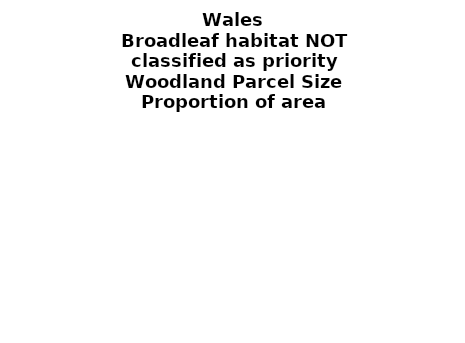
| Category | Broadleaf habitat NOT classified as priority |
|---|---|
| <5 ha | 0.246 |
| ≥5 and <10 ha | 0.048 |
| ≥10 and <15 ha | 0.024 |
| ≥15 and <20 ha | 0.04 |
| ≥20 and <25 ha | 0.022 |
| ≥25 and <30 ha | 0.012 |
| ≥30 and <35 ha | 0.043 |
| ≥35 and <40 ha | 0.003 |
| ≥40 and <45 ha | 0.01 |
| ≥45 and <50 ha | 0.046 |
| ≥50 and <60 ha | 0.008 |
| ≥60 and <70 ha | 0.004 |
| ≥70 and <80 ha | 0.001 |
| ≥80 and <90 ha | 0.011 |
| ≥90 and <100 ha | 0.023 |
| ≥100 and <150 ha | 0.019 |
| ≥150 and <200 ha | 0.015 |
| ≥200 ha | 0.425 |